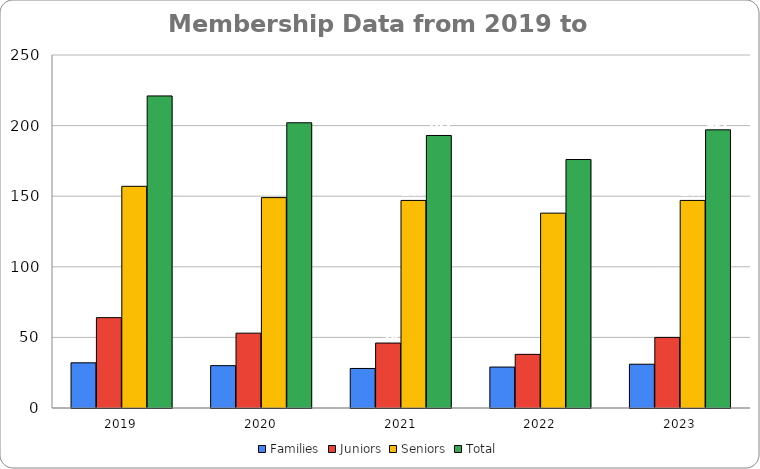
| Category | Families | Juniors | Seniors | Total |
|---|---|---|---|---|
| 2019.0 | 32 | 64 | 157 | 221 |
| 2020.0 | 30 | 53 | 149 | 202 |
| 2021.0 | 28 | 46 | 147 | 193 |
| 2022.0 | 29 | 38 | 138 | 176 |
| 2023.0 | 31 | 50 | 147 | 197 |